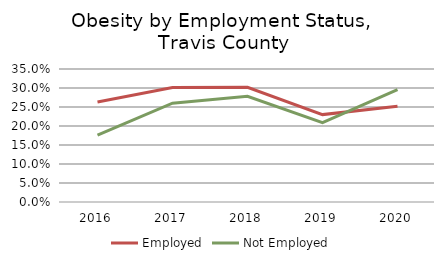
| Category | Employed | Not Employed |
|---|---|---|
| 2016.0 | 0.263 | 0.176 |
| 2017.0 | 0.301 | 0.26 |
| 2018.0 | 0.302 | 0.278 |
| 2019.0 | 0.23 | 0.209 |
| 2020.0 | 0.252 | 0.296 |